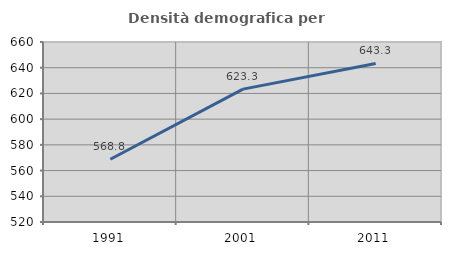
| Category | Densità demografica |
|---|---|
| 1991.0 | 568.836 |
| 2001.0 | 623.34 |
| 2011.0 | 643.347 |